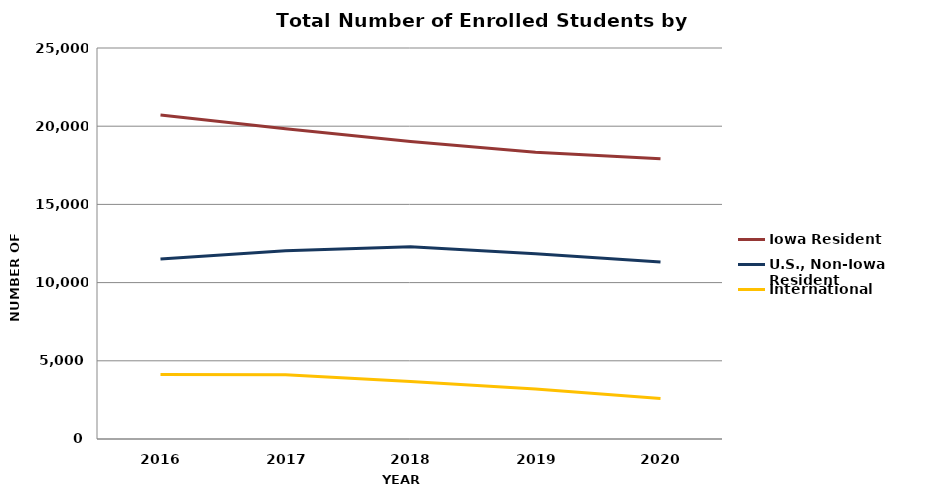
| Category | Iowa Resident | U.S., Non-Iowa Resident | International |
|---|---|---|---|
| 2016.0 | 20713 | 11509 | 4131 |
| 2017.0 | 19843 | 12035 | 4115 |
| 2018.0 | 19022 | 12299 | 3671 |
| 2019.0 | 18341 | 11852 | 3198 |
| 2020.0 | 17911 | 11322 | 2592 |